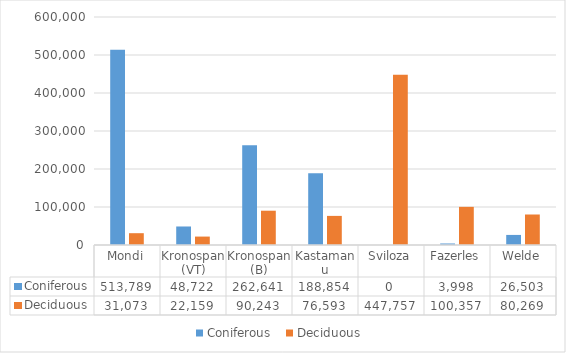
| Category | Coniferous  | Deciduous  |
|---|---|---|
| Mondi | 513789 | 31073 |
| Kronospan (VT) | 48722 | 22159 |
| Kronospan (B) | 262641 | 90243 |
| Kastamanu | 188854 | 76593 |
| Sviloza | 0 | 447757 |
| Fazerles | 3998 | 100357 |
| Welde | 26503 | 80269 |